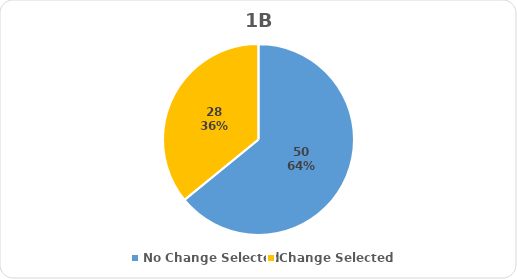
| Category | Series 0 |
|---|---|
| No Change Selected | 50 |
| Change Selected | 28 |